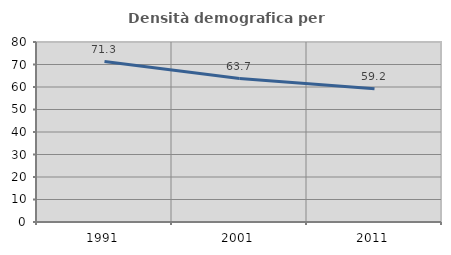
| Category | Densità demografica |
|---|---|
| 1991.0 | 71.321 |
| 2001.0 | 63.742 |
| 2011.0 | 59.233 |